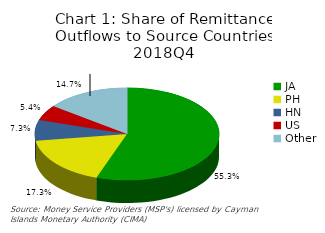
| Category | Chart 1: Share of Remittance Outflows to Source Countries 2018Q4 |
|---|---|
| JA | 0.553 |
| PH | 0.173 |
| HN | 0.073 |
| US | 0.054 |
| Other | 0.147 |